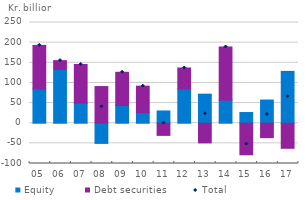
| Category | Equity | Debt securities |
|---|---|---|
| 05 | 85 | 108.2 |
| 06 | 133.8 | 21.5 |
| 07 | 49.8 | 95.9 |
| 08 | -50.1 | 91 |
| 09 | 43.9 | 82.5 |
| 10 | 26 | 66 |
| 11 | 30.4 | -30.2 |
| 12 | 84.8 | 52.3 |
| 13 | 72.1 | -48.8 |
| 14 | 57.2 | 132 |
| 15 | 26.5 | -78.4 |
| 16 | 57.5 | -35.8 |
| 17 | 128.7 | -62.3 |